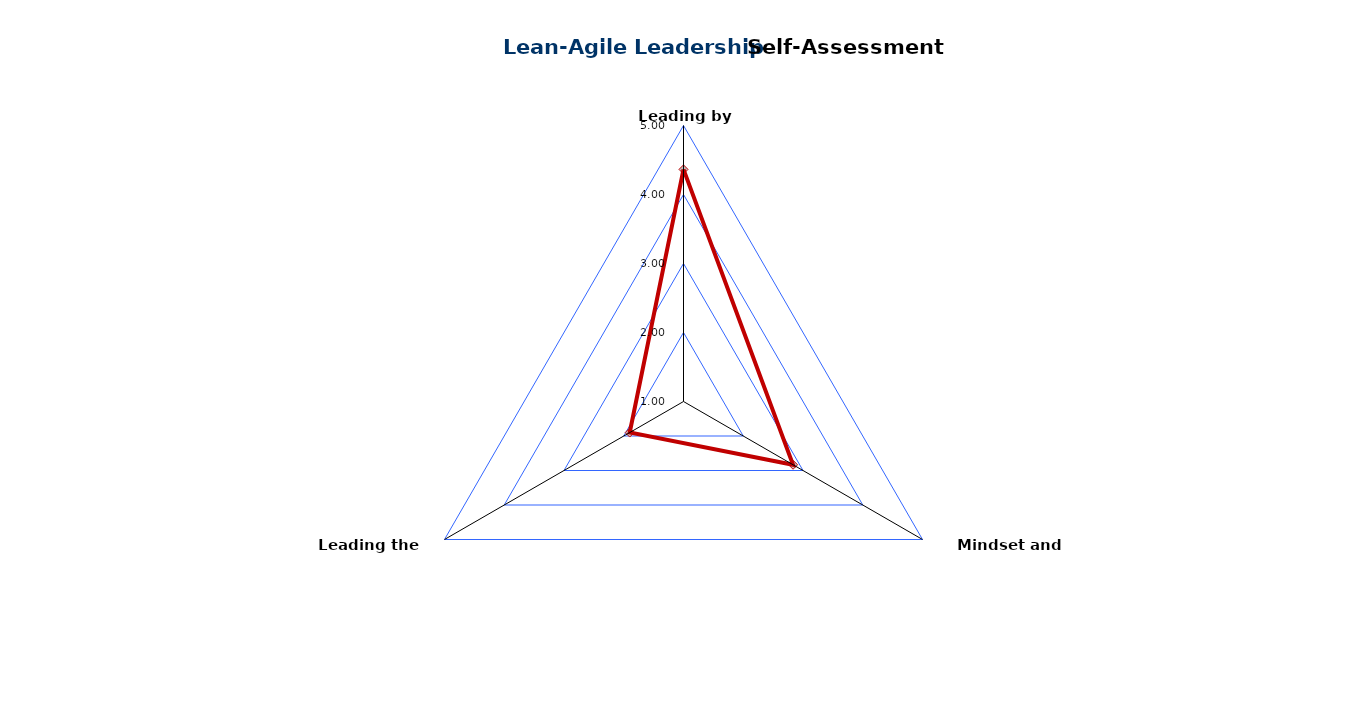
| Category | Lean-Agile Leadership |
|---|---|
| Leading by Example | 4.364 |
| Mindset and Principles | 2.833 |
| Leading the Change | 1.9 |